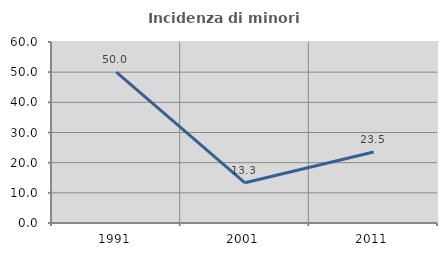
| Category | Incidenza di minori stranieri |
|---|---|
| 1991.0 | 50 |
| 2001.0 | 13.333 |
| 2011.0 | 23.529 |